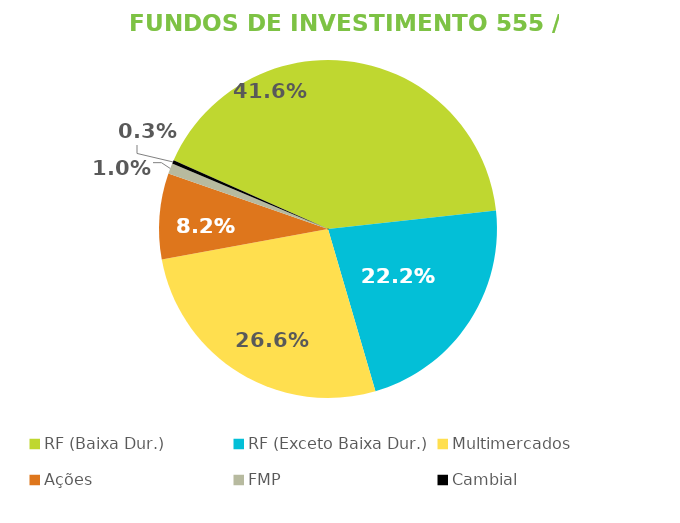
| Category | Fundos de Investimento 555 / FMP |
|---|---|
| RF (Baixa Dur.) | 0.416 |
| RF (Exceto Baixa Dur.) | 0.222 |
| Multimercados | 0.266 |
| Ações | 0.082 |
| FMP | 0.01 |
| Cambial | 0.003 |